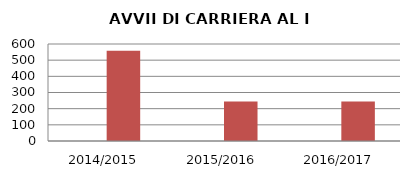
| Category | ANNO | NUMERO |
|---|---|---|
| 2014/2015 | 0 | 559 |
| 2015/2016 | 0 | 244 |
| 2016/2017 | 0 | 245 |